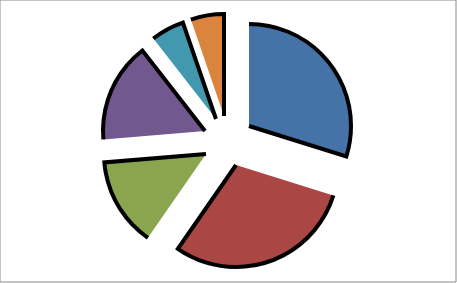
| Category | Series 0 |
|---|---|
| ENZYME | 17 |
| OTHER | 17 |
| TRANSPORTER | 8 |
| TRANSCRIPTION | 9 |
| TRANSLATION | 3 |
| CHAPERONE | 3 |